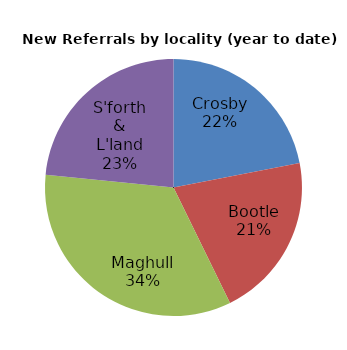
| Category | Series 0 |
|---|---|
| Crosby | 59 |
| Bootle | 56 |
| Maghull | 91 |
| S'forth & L'land | 63 |